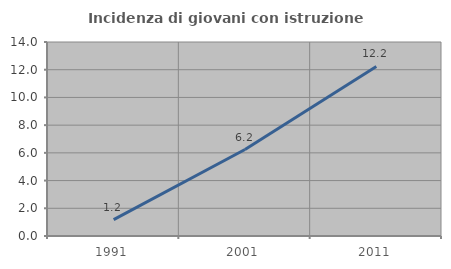
| Category | Incidenza di giovani con istruzione universitaria |
|---|---|
| 1991.0 | 1.176 |
| 2001.0 | 6.239 |
| 2011.0 | 12.234 |